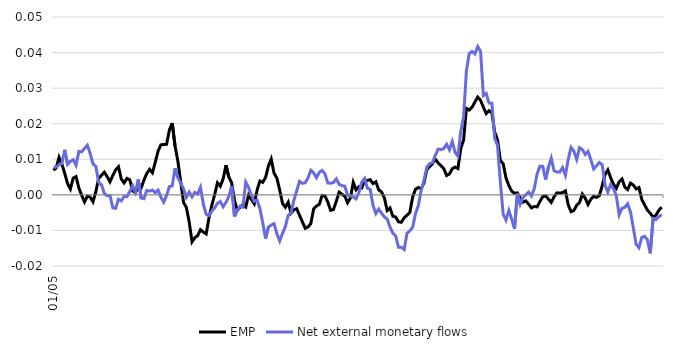
| Category | EMP | Net external monetary flows |
|---|---|---|
| 2005-01-01 | 0.007 | 0.008 |
| 2005-02-01 | 0.008 | 0.008 |
| 2005-03-01 | 0.011 | 0.008 |
| 2005-04-01 | 0.009 | 0.009 |
| 2005-05-01 | 0.006 | 0.013 |
| 2005-06-01 | 0.003 | 0.009 |
| 2005-07-01 | 0.002 | 0.009 |
| 2005-08-01 | 0.005 | 0.01 |
| 2005-09-01 | 0.005 | 0.008 |
| 2005-10-01 | 0.002 | 0.012 |
| 2005-11-01 | 0 | 0.012 |
| 2005-12-01 | -0.002 | 0.013 |
| 2006-01-01 | 0 | 0.014 |
| 2006-02-01 | -0.001 | 0.012 |
| 2006-03-01 | -0.002 | 0.009 |
| 2006-04-01 | 0.001 | 0.008 |
| 2006-05-01 | 0.005 | 0.003 |
| 2006-06-01 | 0.006 | 0.003 |
| 2006-07-01 | 0.006 | 0 |
| 2006-08-01 | 0.005 | 0 |
| 2006-09-01 | 0.004 | 0 |
| 2006-10-01 | 0.005 | -0.004 |
| 2006-11-01 | 0.007 | -0.004 |
| 2006-12-01 | 0.008 | -0.001 |
| 2007-01-01 | 0.004 | -0.002 |
| 2007-02-01 | 0.003 | 0 |
| 2007-03-01 | 0.005 | -0.001 |
| 2007-04-01 | 0.004 | 0.001 |
| 2007-05-01 | 0.001 | 0.003 |
| 2007-06-01 | 0.001 | 0.001 |
| 2007-07-01 | 0.002 | 0.004 |
| 2007-08-01 | 0.002 | -0.001 |
| 2007-09-01 | 0.004 | -0.001 |
| 2007-10-01 | 0.006 | 0.001 |
| 2007-11-01 | 0.007 | 0.001 |
| 2007-12-01 | 0.006 | 0.001 |
| 2008-01-01 | 0.009 | 0.001 |
| 2008-02-01 | 0.012 | 0.001 |
| 2008-03-01 | 0.014 | -0.001 |
| 2008-04-01 | 0.014 | -0.002 |
| 2008-05-01 | 0.014 | 0 |
| 2008-06-01 | 0.018 | 0.002 |
| 2008-07-01 | 0.02 | 0.003 |
| 2008-08-01 | 0.014 | 0.008 |
| 2008-09-01 | 0.009 | 0.005 |
| 2008-10-01 | 0.004 | 0.003 |
| 2008-11-01 | -0.002 | 0.002 |
| 2008-12-01 | -0.004 | -0.001 |
| 2009-01-01 | -0.008 | 0.001 |
| 2009-02-01 | -0.013 | -0.001 |
| 2009-03-01 | -0.012 | 0.001 |
| 2009-04-01 | -0.011 | 0 |
| 2009-05-01 | -0.01 | 0.002 |
| 2009-06-01 | -0.01 | -0.003 |
| 2009-07-01 | -0.011 | -0.005 |
| 2009-08-01 | -0.006 | -0.006 |
| 2009-09-01 | -0.003 | -0.005 |
| 2009-10-01 | 0 | -0.004 |
| 2009-11-01 | 0.003 | -0.002 |
| 2009-12-01 | 0.002 | -0.002 |
| 2010-01-01 | 0.004 | -0.003 |
| 2010-02-01 | 0.008 | -0.002 |
| 2010-03-01 | 0.005 | 0 |
| 2010-04-01 | 0.003 | 0.002 |
| 2010-05-01 | -0.002 | -0.006 |
| 2010-06-01 | -0.004 | -0.004 |
| 2010-07-01 | -0.004 | -0.003 |
| 2010-08-01 | -0.003 | -0.003 |
| 2010-09-01 | -0.003 | 0.004 |
| 2010-10-01 | 0 | 0.002 |
| 2010-11-01 | -0.001 | 0 |
| 2010-12-01 | -0.003 | -0.002 |
| 2011-01-01 | 0.001 | -0.001 |
| 2011-02-01 | 0.004 | -0.004 |
| 2011-03-01 | 0.004 | -0.008 |
| 2011-04-01 | 0.005 | -0.012 |
| 2011-05-01 | 0.008 | -0.009 |
| 2011-06-01 | 0.01 | -0.008 |
| 2011-07-01 | 0.006 | -0.008 |
| 2011-08-01 | 0.005 | -0.011 |
| 2011-09-01 | 0.001 | -0.013 |
| 2011-10-01 | -0.002 | -0.011 |
| 2011-11-01 | -0.003 | -0.009 |
| 2011-12-01 | -0.002 | -0.006 |
| 2012-01-01 | -0.005 | -0.005 |
| 2012-02-01 | -0.004 | -0.002 |
| 2012-03-01 | -0.004 | 0.001 |
| 2012-04-01 | -0.006 | 0.004 |
| 2012-05-01 | -0.008 | 0.003 |
| 2012-06-01 | -0.009 | 0.003 |
| 2012-07-01 | -0.009 | 0.005 |
| 2012-08-01 | -0.008 | 0.007 |
| 2012-09-01 | -0.004 | 0.006 |
| 2012-10-01 | -0.003 | 0.005 |
| 2012-11-01 | -0.003 | 0.006 |
| 2012-12-01 | 0 | 0.007 |
| 2013-01-01 | 0 | 0.006 |
| 2013-02-01 | -0.002 | 0.003 |
| 2013-03-01 | -0.004 | 0.003 |
| 2013-04-01 | -0.004 | 0.003 |
| 2013-05-01 | -0.002 | 0.004 |
| 2013-06-01 | 0.001 | 0.003 |
| 2013-07-01 | 0 | 0.003 |
| 2013-08-01 | 0 | 0.002 |
| 2013-09-01 | -0.002 | 0 |
| 2013-10-01 | -0.001 | 0 |
| 2013-11-01 | 0.004 | -0.001 |
| 2013-12-01 | 0.001 | -0.001 |
| 2014-01-01 | 0.002 | 0.001 |
| 2014-02-01 | 0.002 | 0.004 |
| 2014-03-01 | 0.004 | 0.005 |
| 2014-04-01 | 0.004 | 0.002 |
| 2014-05-01 | 0.004 | 0.002 |
| 2014-06-01 | 0.003 | -0.003 |
| 2014-07-01 | 0.004 | -0.005 |
| 2014-08-01 | 0.001 | -0.004 |
| 2014-09-01 | 0.001 | -0.005 |
| 2014-10-01 | -0.001 | -0.006 |
| 2014-11-01 | -0.004 | -0.007 |
| 2014-12-01 | -0.004 | -0.009 |
| 2015-01-01 | -0.006 | -0.011 |
| 2015-02-01 | -0.006 | -0.012 |
| 2015-03-01 | -0.008 | -0.015 |
| 2015-04-01 | -0.008 | -0.015 |
| 2015-05-01 | -0.006 | -0.015 |
| 2015-06-01 | -0.006 | -0.011 |
| 2015-07-01 | -0.005 | -0.01 |
| 2015-08-01 | -0.001 | -0.009 |
| 2015-09-01 | 0.002 | -0.005 |
| 2015-10-01 | 0.002 | -0.003 |
| 2015-11-01 | 0.002 | 0.001 |
| 2015-12-01 | 0.003 | 0.004 |
| 2016-01-01 | 0.007 | 0.008 |
| 2016-02-01 | 0.008 | 0.009 |
| 2016-03-01 | 0.009 | 0.009 |
| 2016-04-01 | 0.01 | 0.011 |
| 2016-05-01 | 0.009 | 0.013 |
| 2016-06-01 | 0.008 | 0.013 |
| 2016-07-01 | 0.007 | 0.013 |
| 2016-08-01 | 0.005 | 0.014 |
| 2016-09-01 | 0.006 | 0.013 |
| 2016-10-01 | 0.007 | 0.015 |
| 2016-11-01 | 0.008 | 0.012 |
| 2016-12-01 | 0.007 | 0.011 |
| 2017-01-01 | 0.013 | 0.018 |
| 2017-02-01 | 0.015 | 0.022 |
| 2017-03-01 | 0.024 | 0.035 |
| 2017-04-01 | 0.024 | 0.04 |
| 2017-05-01 | 0.025 | 0.04 |
| 2017-06-01 | 0.026 | 0.04 |
| 2017-07-01 | 0.027 | 0.042 |
| 2017-08-01 | 0.027 | 0.04 |
| 2017-09-01 | 0.025 | 0.028 |
| 2017-10-01 | 0.023 | 0.028 |
| 2017-11-01 | 0.024 | 0.026 |
| 2017-12-01 | 0.023 | 0.026 |
| 2018-01-01 | 0.018 | 0.016 |
| 2018-02-01 | 0.015 | 0.014 |
| 2018-03-01 | 0.01 | 0.004 |
| 2018-04-01 | 0.009 | -0.005 |
| 2018-05-01 | 0.005 | -0.007 |
| 2018-06-01 | 0.003 | -0.004 |
| 2018-07-01 | 0.001 | -0.007 |
| 2018-08-01 | 0 | -0.01 |
| 2018-09-01 | 0.001 | 0 |
| 2018-10-01 | -0.001 | -0.003 |
| 2018-11-01 | -0.002 | -0.001 |
| 2018-12-01 | -0.002 | 0 |
| 2019-01-01 | -0.003 | 0.001 |
| 2019-02-01 | -0.004 | 0 |
| 2019-03-01 | -0.003 | 0.002 |
| 2019-04-01 | -0.003 | 0.006 |
| 2019-05-01 | -0.002 | 0.008 |
| 2019-06-01 | 0 | 0.008 |
| 2019-07-01 | 0 | 0.004 |
| 2019-08-01 | -0.001 | 0.008 |
| 2019-09-01 | -0.002 | 0.01 |
| 2019-10-01 | 0 | 0.007 |
| 2019-11-01 | 0.001 | 0.006 |
| 2019-12-01 | 0 | 0.006 |
| 2020-01-01 | 0.001 | 0.008 |
| 2020-02-01 | 0.001 | 0.006 |
| 2020-03-01 | -0.003 | 0.01 |
| 2020-04-01 | -0.005 | 0.013 |
| 2020-05-01 | -0.004 | 0.012 |
| 2020-06-01 | -0.003 | 0.01 |
| 2020-07-01 | -0.002 | 0.013 |
| 2020-08-01 | 0 | 0.013 |
| 2020-09-01 | -0.001 | 0.011 |
| 2020-10-01 | -0.003 | 0.012 |
| 2020-11-01 | -0.001 | 0.01 |
| 2020-12-01 | 0 | 0.007 |
| 2021-01-01 | -0.001 | 0.008 |
| 2021-02-01 | 0 | 0.009 |
| 2021-03-01 | 0.003 | 0.008 |
| 2021-04-01 | 0.006 | 0.003 |
| 2021-05-01 | 0.007 | 0.001 |
| 2021-06-01 | 0.005 | 0.003 |
| 2021-07-01 | 0.003 | 0.002 |
| 2021-08-01 | 0.002 | 0 |
| 2021-09-01 | 0.004 | -0.006 |
| 2021-10-01 | 0.004 | -0.004 |
| 2021-11-01 | 0.002 | -0.004 |
| 2021-12-01 | 0.001 | -0.003 |
| 2022-01-01 | 0.003 | -0.005 |
| 2022-02-01 | 0.003 | -0.009 |
| 2022-03-01 | 0.002 | -0.014 |
| 2022-04-01 | 0.002 | -0.015 |
| 2022-05-01 | -0.001 | -0.012 |
| 2022-06-01 | -0.003 | -0.012 |
| 2022-07-01 | -0.004 | -0.013 |
| 2022-08-01 | -0.005 | -0.016 |
| 2022-09-01 | -0.006 | -0.007 |
| 2022-10-01 | -0.006 | -0.007 |
| 2022-11-01 | -0.004 | -0.006 |
| 2022-12-01 | -0.003 | -0.006 |